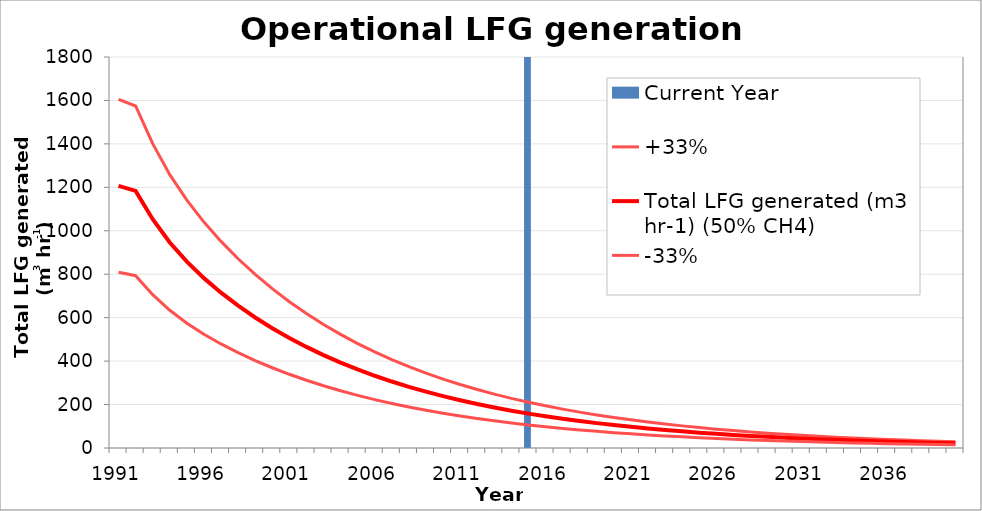
| Category | Current Year |
|---|---|
| 1991.0 | 0 |
| 1992.0 | 0 |
| 1993.0 | 0 |
| 1994.0 | 0 |
| 1995.0 | 0 |
| 1996.0 | 0 |
| 1997.0 | 0 |
| 1998.0 | 0 |
| 1999.0 | 0 |
| 2000.0 | 0 |
| 2001.0 | 0 |
| 2002.0 | 0 |
| 2003.0 | 0 |
| 2004.0 | 0 |
| 2005.0 | 0 |
| 2006.0 | 0 |
| 2007.0 | 0 |
| 2008.0 | 0 |
| 2009.0 | 0 |
| 2010.0 | 0 |
| 2011.0 | 0 |
| 2012.0 | 0 |
| 2013.0 | 0 |
| 2014.0 | 0 |
| 2015.0 | 1 |
| 2016.0 | 0 |
| 2017.0 | 0 |
| 2018.0 | 0 |
| 2019.0 | 0 |
| 2020.0 | 0 |
| 2021.0 | 0 |
| 2022.0 | 0 |
| 2023.0 | 0 |
| 2024.0 | 0 |
| 2025.0 | 0 |
| 2026.0 | 0 |
| 2027.0 | 0 |
| 2028.0 | 0 |
| 2029.0 | 0 |
| 2030.0 | 0 |
| 2031.0 | 0 |
| 2032.0 | 0 |
| 2033.0 | 0 |
| 2034.0 | 0 |
| 2035.0 | 0 |
| 2036.0 | 0 |
| 2037.0 | 0 |
| 2038.0 | 0 |
| 2039.0 | 0 |
| 2040.0 | 0 |